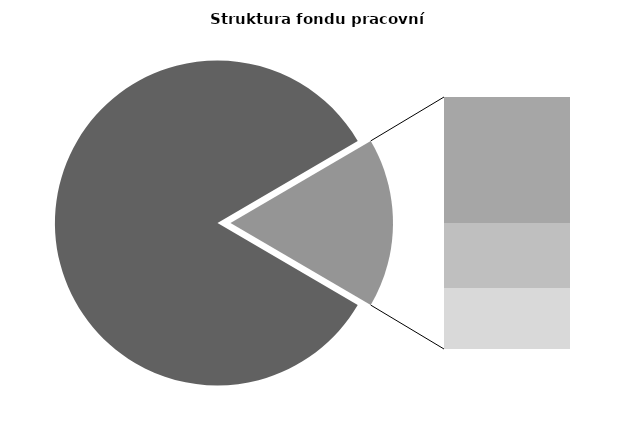
| Category | Series 0 |
|---|---|
| Průměrná měsíční odpracovaná doba bez přesčasu | 141.25 |
| Dovolená | 14.333 |
| Nemoc | 7.365 |
| Jiné | 6.945 |